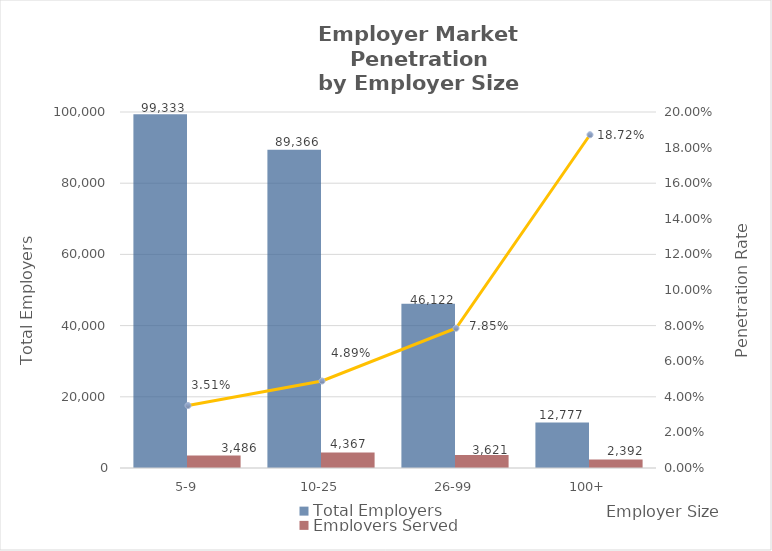
| Category | Total Employers | Employers Served |
|---|---|---|
| 5-9 | 99333 | 3486 |
| 10-25 | 89366 | 4367 |
| 26-99 | 46122 | 3621 |
| 100+ | 12777 | 2392 |